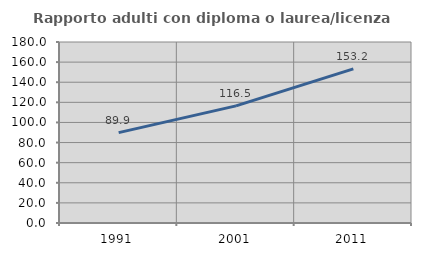
| Category | Rapporto adulti con diploma o laurea/licenza media  |
|---|---|
| 1991.0 | 89.852 |
| 2001.0 | 116.452 |
| 2011.0 | 153.24 |